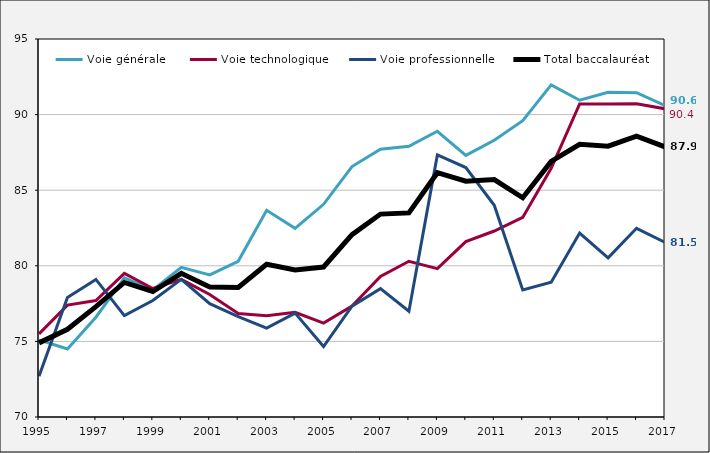
| Category | Voie générale  | Voie technologique | Voie professionnelle | Total baccalauréat |
|---|---|---|---|---|
| 1995 | 75.1 | 75.5 | 72.7 | 74.9 |
| 1996 | 74.5 | 77.4 | 77.9 | 75.8 |
| 1997 | 76.6 | 77.7 | 79.1 | 77.3 |
| 1998 | 79.2 | 79.5 | 76.7 | 78.9 |
| 1999 | 78.4 | 78.5 | 77.7 | 78.3 |
| 2000 | 79.9 | 79.1 | 79.1 | 79.5 |
| 2001 | 79.4 | 78.1 | 77.5 | 78.6 |
| 2002 | 80.297 | 76.838 | 76.645 | 78.57 |
| 2003 | 83.669 | 76.703 | 75.876 | 80.104 |
| 2004 | 82.477 | 76.92 | 76.873 | 79.725 |
| 2005 | 84.065 | 76.211 | 74.657 | 79.921 |
| 2006 | 86.566 | 77.333 | 77.333 | 82.056 |
| 2007 | 87.704 | 79.291 | 78.487 | 83.419 |
| 2008 | 87.9 | 80.3 | 77 | 83.5 |
| 2009 | 88.898 | 79.81 | 87.33 | 86.156 |
| 2010 | 87.3 | 81.6 | 86.5 | 85.6 |
| 2011 | 88.3 | 82.3 | 84 | 85.7 |
| 2012 | 89.6 | 83.2 | 78.4 | 84.5 |
| 2013 | 91.964 | 86.452 | 78.908 | 86.906 |
| 2014 | 90.953 | 90.702 | 82.162 | 88.031 |
| 2015 | 91.477 | 90.699 | 80.522 | 87.91 |
| 2016 | 91.452 | 90.724 | 82.48 | 88.575 |
| 2017 | 90.592 | 90.385 | 81.546 | 87.863 |